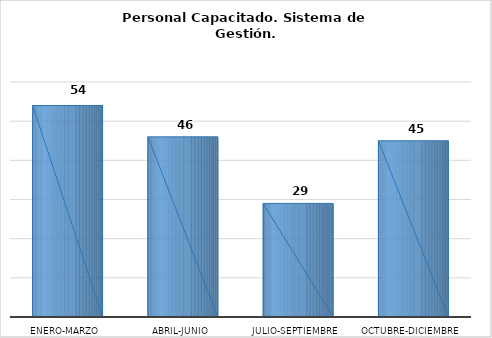
| Category | Personal capacitado |
|---|---|
| Enero-Marzo | 54 |
| Abril-Junio | 46 |
| Julio-Septiembre | 29 |
| Octubre-Diciembre | 45 |